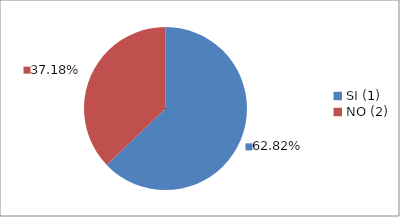
| Category | Series 0 |
|---|---|
| SI (1) | 0.628 |
| NO (2) | 0.372 |